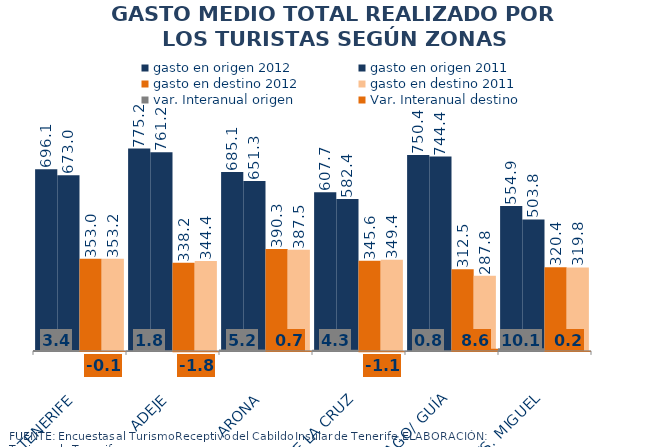
| Category | gasto en origen 2012 | gasto en origen 2011 | gasto en destino 2012 | gasto en destino 2011 |
|---|---|---|---|---|
| TENERIFE | 696.134 | 673.03 | 353.009 | 353.187 |
| ADEJE | 775.166 | 761.207 | 338.159 | 344.414 |
| ARONA | 685.092 | 651.348 | 390.302 | 387.507 |
| PUERTO DE LA CRUZ | 607.655 | 582.356 | 345.614 | 349.431 |
| SANTIAGO/ GUÍA | 750.406 | 744.417 | 312.479 | 287.807 |
| GRANADILLA/S. MIGUEL | 554.874 | 503.803 | 320.375 | 319.846 |